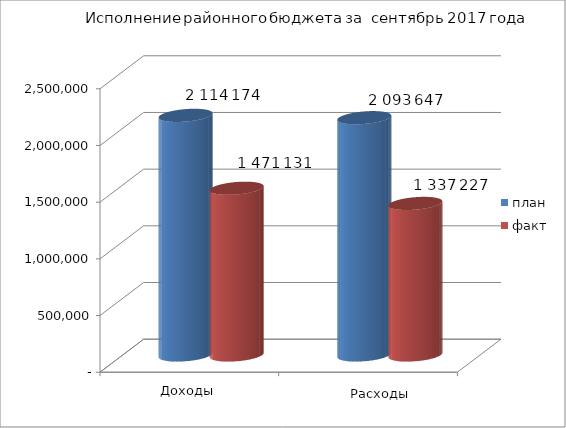
| Category | план | факт |
|---|---|---|
| 0 | 2114174 | 1471131 |
| 1 | 2093647 | 1337226.92 |